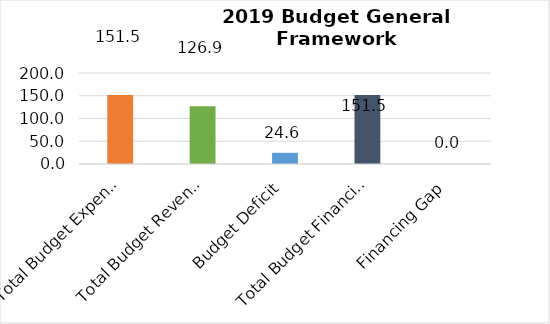
| Category | 2019 Approved Budget Billion Naira |
|---|---|
| Total Budget Expenditure | 151.462 |
| Total Budget Revenue and Grants | 126.877 |
| Budget Deficit | 24.585 |
| Total Budget Financing | 151.462 |
| Financing Gap | 0 |